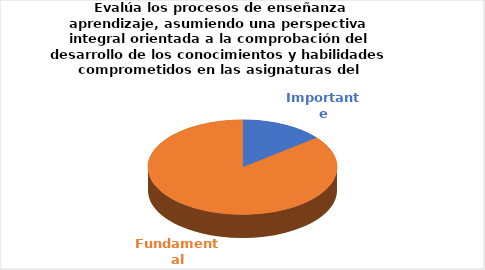
| Category | Series 0 |
|---|---|
| Importante | 2 |
| Fundamental | 12 |